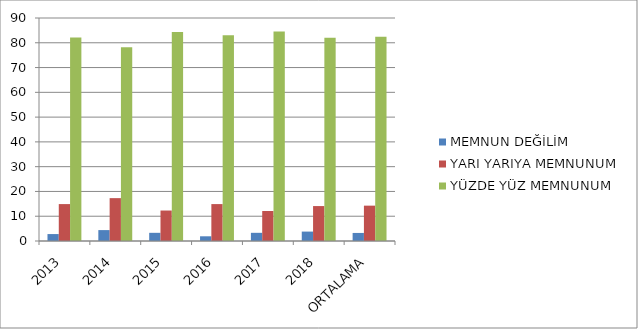
| Category | MEMNUN DEĞİLİM | YARI YARIYA MEMNUNUM | YÜZDE YÜZ MEMNUNUM |
|---|---|---|---|
| 2013 | 2.8 | 14.9 | 82.1 |
| 2014 | 4.4 | 17.3 | 78.2 |
| 2015 | 3.3 | 12.3 | 84.4 |
| 2016 | 1.9 | 14.9 | 83 |
| 2017 | 3.3 | 12.1 | 84.6 |
| 2018 | 3.8 | 14.1 | 82 |
| ORTALAMA | 3.25 | 14.267 | 82.383 |